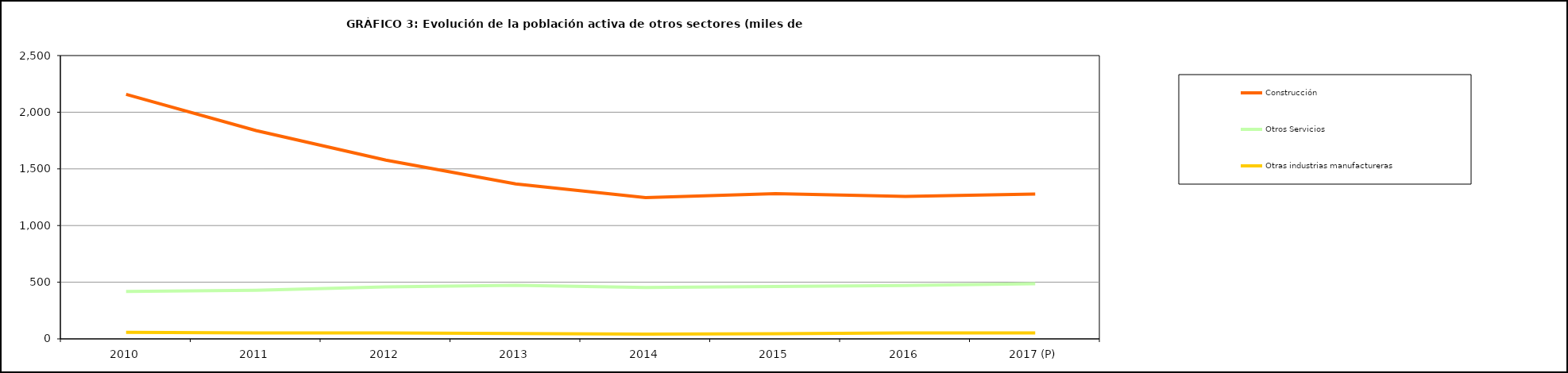
| Category | Construcción | Otros Servicios | Otras industrias manufactureras |
|---|---|---|---|
| 2010 | 2158.15 | 418.775 | 58.075 |
| 2011 | 1837.95 | 428.625 | 52.3 |
| 2012 | 1576.925 | 459.15 | 52.8 |
| 2013 | 1366.878 | 473.15 | 46.85 |
| 2014 | 1247.2 | 454.2 | 42.2 |
| 2015 | 1280.975 | 462.325 | 44.95 |
| 2016 | 1256.45 | 471.23 | 52.98 |
| 2017 (P) | 1278.6 | 486.4 | 52.6 |